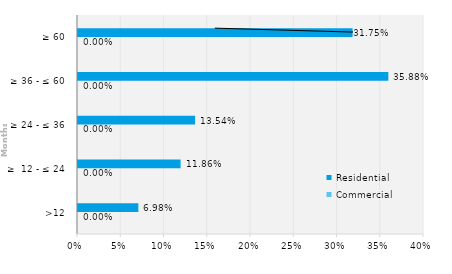
| Category | Commercial | Residential |
|---|---|---|
| >12 | 0 | 0.07 |
| ≥  12 - ≤ 24 | 0 | 0.119 |
| ≥ 24 - ≤ 36 | 0 | 0.135 |
| ≥ 36 - ≤ 60 | 0 | 0.359 |
| ≥ 60 | 0 | 0.317 |